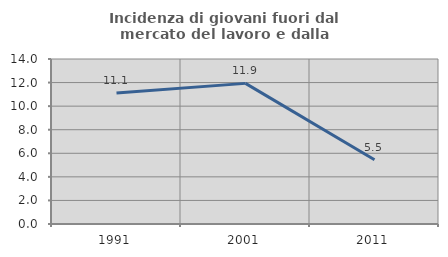
| Category | Incidenza di giovani fuori dal mercato del lavoro e dalla formazione  |
|---|---|
| 1991.0 | 11.111 |
| 2001.0 | 11.932 |
| 2011.0 | 5.455 |